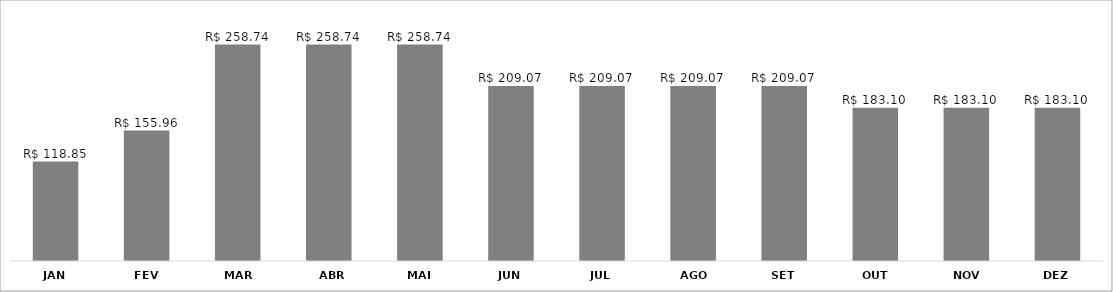
| Category | Series 0 |
|---|---|
| JAN | 118.848 |
| FEV | 155.958 |
| MAR | 258.736 |
| ABR | 258.736 |
| MAI | 258.736 |
| JUN | 209.069 |
| JUL | 209.069 |
| AGO | 209.069 |
| SET | 209.069 |
| OUT | 183.099 |
| NOV | 183.099 |
| DEZ | 183.099 |